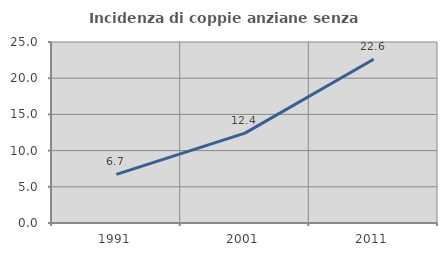
| Category | Incidenza di coppie anziane senza figli  |
|---|---|
| 1991.0 | 6.724 |
| 2001.0 | 12.413 |
| 2011.0 | 22.621 |